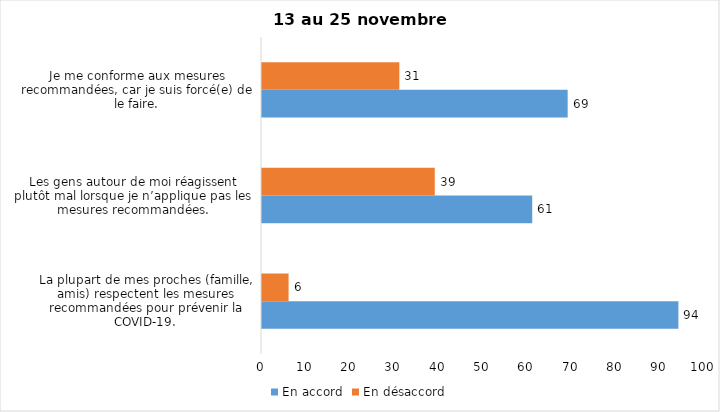
| Category | En accord | En désaccord |
|---|---|---|
| La plupart de mes proches (famille, amis) respectent les mesures recommandées pour prévenir la COVID-19. | 94 | 6 |
| Les gens autour de moi réagissent plutôt mal lorsque je n’applique pas les mesures recommandées. | 61 | 39 |
| Je me conforme aux mesures recommandées, car je suis forcé(e) de le faire. | 69 | 31 |